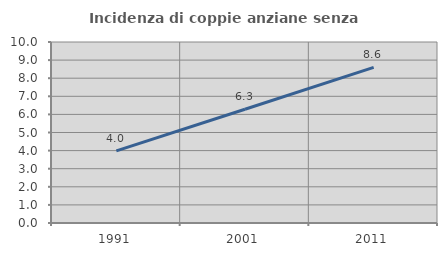
| Category | Incidenza di coppie anziane senza figli  |
|---|---|
| 1991.0 | 3.984 |
| 2001.0 | 6.284 |
| 2011.0 | 8.601 |